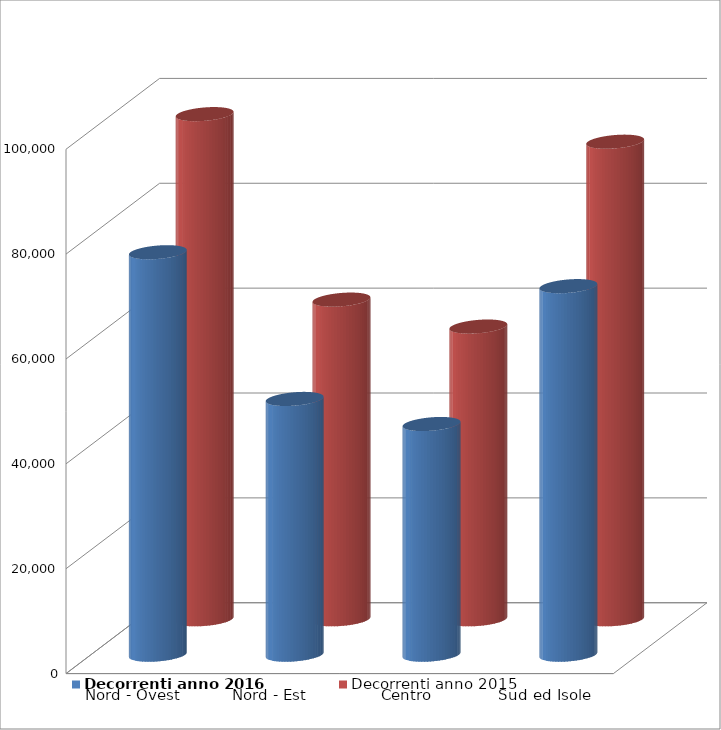
| Category | Decorrenti anno 2016 | Decorrenti anno 2015 |
|---|---|---|
| Nord - Ovest | 76759 | 96341 |
| Nord - Est | 48778 | 60964 |
| Centro | 43997 | 55828 |
| Sud ed Isole | 70291 | 91084 |